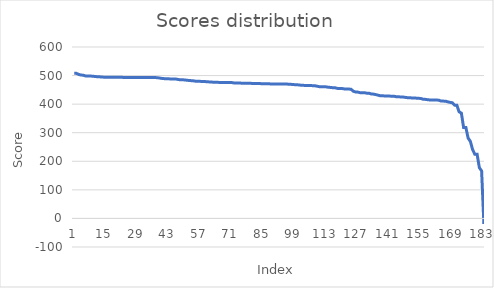
| Category | Series 0 |
|---|---|
| 0 | 507.8 |
| 1 | 507.8 |
| 2 | 504.1 |
| 3 | 502 |
| 4 | 501.3 |
| 5 | 498.9 |
| 6 | 498.9 |
| 7 | 498.7 |
| 8 | 497.8 |
| 9 | 497.1 |
| 10 | 496.2 |
| 11 | 495.8 |
| 12 | 495.1 |
| 13 | 494.5 |
| 14 | 494.5 |
| 15 | 494.5 |
| 16 | 494.5 |
| 17 | 494.5 |
| 18 | 494.5 |
| 19 | 494.2 |
| 20 | 494.1 |
| 21 | 494 |
| 22 | 493.4 |
| 23 | 493.4 |
| 24 | 493.4 |
| 25 | 493.3 |
| 26 | 493.3 |
| 27 | 493.2 |
| 28 | 493.2 |
| 29 | 493.2 |
| 30 | 493.2 |
| 31 | 493.2 |
| 32 | 493.2 |
| 33 | 493.2 |
| 34 | 493.2 |
| 35 | 493.2 |
| 36 | 493.2 |
| 37 | 492.4 |
| 38 | 491.4 |
| 39 | 490 |
| 40 | 489.3 |
| 41 | 489.1 |
| 42 | 488.5 |
| 43 | 488.3 |
| 44 | 488.1 |
| 45 | 488.1 |
| 46 | 486.7 |
| 47 | 485.2 |
| 48 | 485.2 |
| 49 | 484.8 |
| 50 | 483.8 |
| 51 | 482.9 |
| 52 | 482.2 |
| 53 | 481.6 |
| 54 | 480.1 |
| 55 | 479.7 |
| 56 | 479.7 |
| 57 | 479.5 |
| 58 | 479.1 |
| 59 | 478.4 |
| 60 | 477.8 |
| 61 | 477.3 |
| 62 | 476.7 |
| 63 | 476.2 |
| 64 | 476.2 |
| 65 | 476 |
| 66 | 476 |
| 67 | 475.7 |
| 68 | 475.7 |
| 69 | 475.6 |
| 70 | 475.5 |
| 71 | 474.3 |
| 72 | 474.1 |
| 73 | 474.1 |
| 74 | 473.6 |
| 75 | 472.9 |
| 76 | 472.9 |
| 77 | 472.9 |
| 78 | 472.9 |
| 79 | 472.6 |
| 80 | 472.6 |
| 81 | 472.5 |
| 82 | 472.3 |
| 83 | 471.7 |
| 84 | 471.7 |
| 85 | 471.7 |
| 86 | 471.5 |
| 87 | 470.9 |
| 88 | 470.7 |
| 89 | 470.7 |
| 90 | 470.7 |
| 91 | 470.7 |
| 92 | 470.7 |
| 93 | 470.7 |
| 94 | 470.3 |
| 95 | 470 |
| 96 | 469.7 |
| 97 | 468.7 |
| 98 | 468.2 |
| 99 | 467.6 |
| 100 | 467.3 |
| 101 | 465.7 |
| 102 | 465.7 |
| 103 | 465.6 |
| 104 | 465.6 |
| 105 | 465.2 |
| 106 | 464.6 |
| 107 | 464.3 |
| 108 | 462.5 |
| 109 | 461.1 |
| 110 | 461.1 |
| 111 | 461.1 |
| 112 | 460.4 |
| 113 | 459.1 |
| 114 | 458.4 |
| 115 | 457.4 |
| 116 | 457.1 |
| 117 | 455 |
| 118 | 454.7 |
| 119 | 454.6 |
| 120 | 453.4 |
| 121 | 452.8 |
| 122 | 452.8 |
| 123 | 452.1 |
| 124 | 445.3 |
| 125 | 442.6 |
| 126 | 442.1 |
| 127 | 440.1 |
| 128 | 440.1 |
| 129 | 440.1 |
| 130 | 438.2 |
| 131 | 438.2 |
| 132 | 435.7 |
| 133 | 435 |
| 134 | 433.4 |
| 135 | 431.4 |
| 136 | 429.2 |
| 137 | 429.2 |
| 138 | 428.7 |
| 139 | 428.1 |
| 140 | 428.1 |
| 141 | 428 |
| 142 | 427.9 |
| 143 | 426 |
| 144 | 426 |
| 145 | 425.1 |
| 146 | 424.9 |
| 147 | 423.9 |
| 148 | 422.7 |
| 149 | 422.2 |
| 150 | 421.8 |
| 151 | 421.7 |
| 152 | 421 |
| 153 | 420.5 |
| 154 | 419.7 |
| 155 | 417.2 |
| 156 | 416.7 |
| 157 | 415.6 |
| 158 | 414.6 |
| 159 | 414.4 |
| 160 | 414.2 |
| 161 | 414.2 |
| 162 | 413.9 |
| 163 | 410.7 |
| 164 | 410.6 |
| 165 | 410.4 |
| 166 | 408 |
| 167 | 406.2 |
| 168 | 404.9 |
| 169 | 396.5 |
| 170 | 396 |
| 171 | 373.2 |
| 172 | 368.6 |
| 173 | 318.5 |
| 174 | 318.5 |
| 175 | 281.3 |
| 176 | 269.5 |
| 177 | 240.7 |
| 178 | 224.4 |
| 179 | 224.4 |
| 180 | 177.6 |
| 181 | 166.2 |
| 182 | -19.3 |